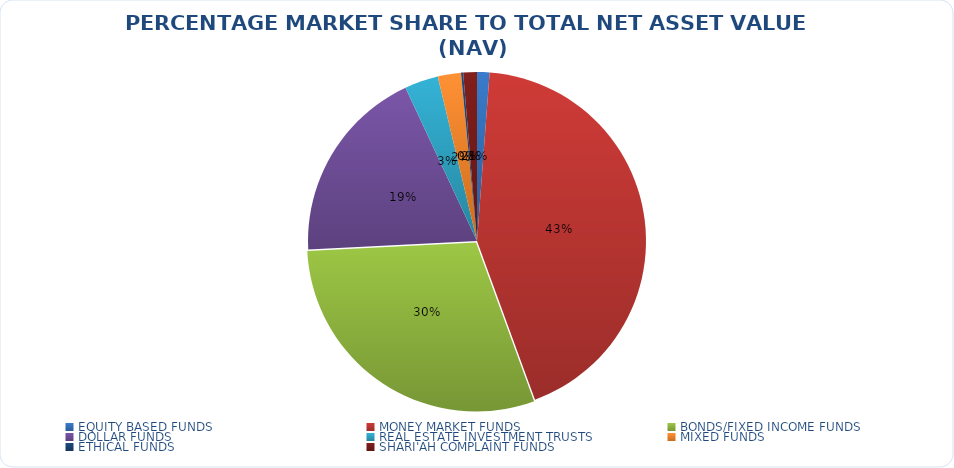
| Category | NET ASSET VALUE |
|---|---|
| EQUITY BASED FUNDS | 16874828381.6 |
| MONEY MARKET FUNDS | 612176111572.46 |
| BONDS/FIXED INCOME FUNDS | 421480231599.46 |
| DOLLAR FUNDS | 267074063470.478 |
| REAL ESTATE INVESTMENT TRUSTS | 45618645084.03 |
| MIXED FUNDS | 31408962329.74 |
| ETHICAL FUNDS | 2937084260.74 |
| SHARI'AH COMPLAINT FUNDS | 18471484417.84 |